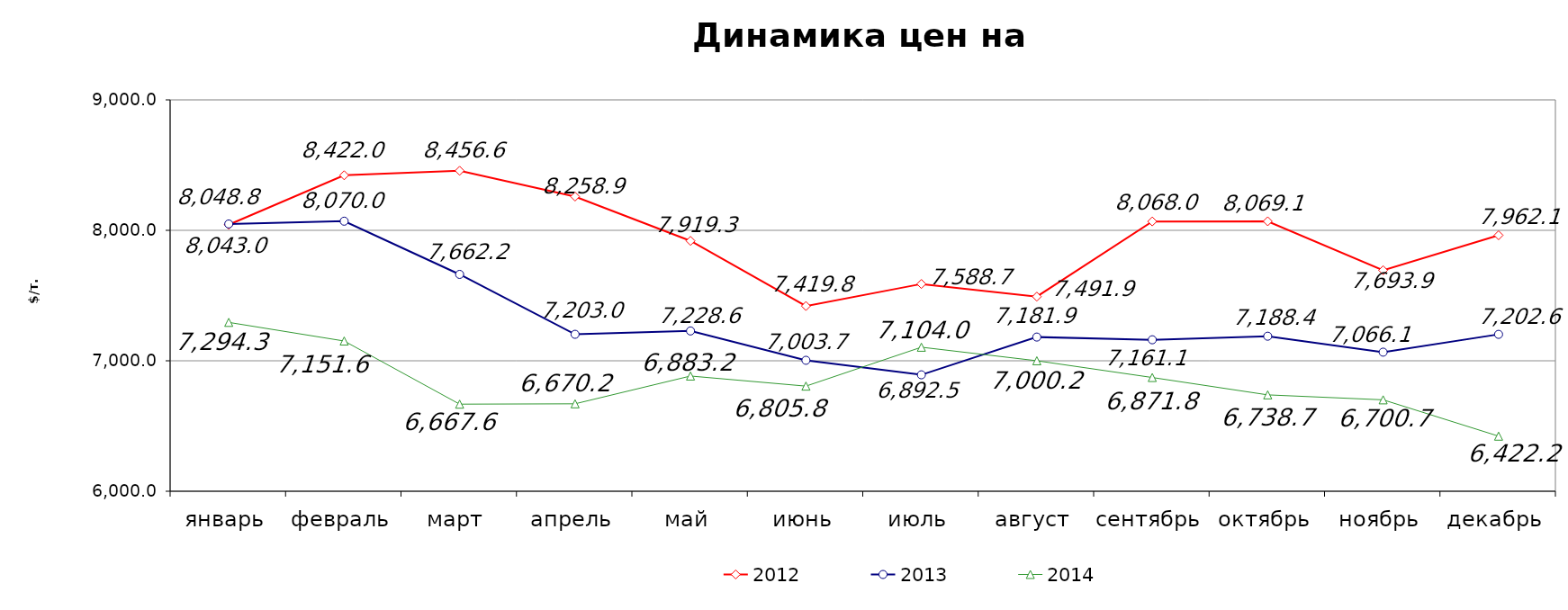
| Category | 2012 | 2013 | 2014 |
|---|---|---|---|
| январь | 8043 | 8048.771 | 7294.328 |
| февраль | 8422.03 | 8070.02 | 7151.58 |
| март | 8456.55 | 7662.24 | 6667.56 |
| апрель | 8258.881 | 7202.97 | 6670.24 |
| май | 7919.286 | 7228.62 | 6883.15 |
| июнь | 7419.788 | 7003.715 | 6805.8 |
| июль | 7588.7 | 6892.509 | 7104.02 |
| август | 7491.9 | 7181.88 | 7000.175 |
| сентябрь | 8068 | 7161.11 | 6871.829 |
| октябрь | 8069.08 | 7188.38 | 6738.73 |
| ноябрь | 7693.92 | 7066.06 | 6700.67 |
| декабрь | 7962.09 | 7202.55 | 6422.23 |